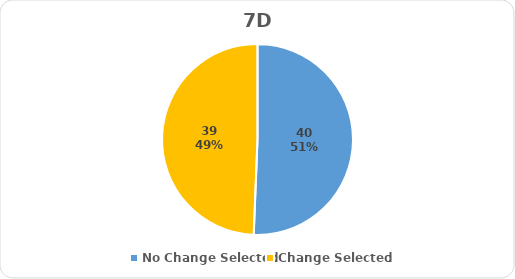
| Category | Series 0 |
|---|---|
| No Change Selected | 40 |
| Change Selected | 39 |